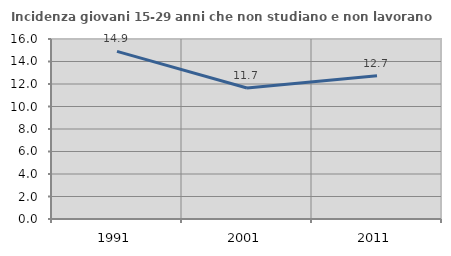
| Category | Incidenza giovani 15-29 anni che non studiano e non lavorano  |
|---|---|
| 1991.0 | 14.902 |
| 2001.0 | 11.65 |
| 2011.0 | 12.743 |